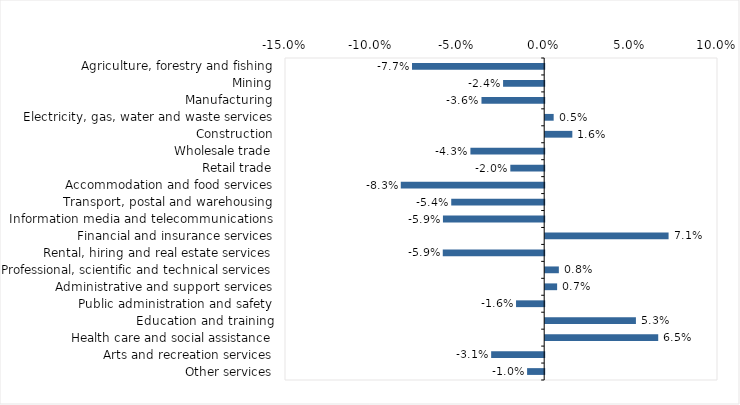
| Category | This week |
|---|---|
| Agriculture, forestry and fishing | -0.076 |
| Mining | -0.024 |
| Manufacturing | -0.036 |
| Electricity, gas, water and waste services | 0.005 |
| Construction | 0.016 |
| Wholesale trade | -0.043 |
| Retail trade | -0.02 |
| Accommodation and food services | -0.083 |
| Transport, postal and warehousing | -0.054 |
| Information media and telecommunications | -0.059 |
| Financial and insurance services | 0.071 |
| Rental, hiring and real estate services | -0.059 |
| Professional, scientific and technical services | 0.008 |
| Administrative and support services | 0.007 |
| Public administration and safety | -0.016 |
| Education and training | 0.052 |
| Health care and social assistance | 0.065 |
| Arts and recreation services | -0.031 |
| Other services | -0.01 |